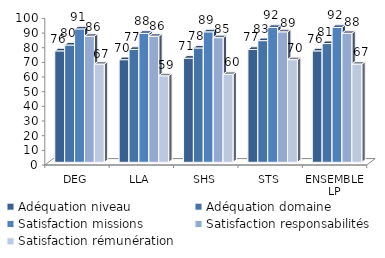
| Category | Adéquation niveau | Adéquation domaine | Satisfaction missions | Satisfaction responsabilités | Satisfaction rémunération |
|---|---|---|---|---|---|
| DEG | 76 | 80 | 91 | 86 | 67 |
| LLA | 70 | 77 | 88 | 86 | 59 |
| SHS | 71 | 78 | 89 | 85 | 60 |
| STS | 77 | 83 | 92 | 89 | 70 |
| ENSEMBLE LP | 76 | 81 | 92 | 88 | 67 |